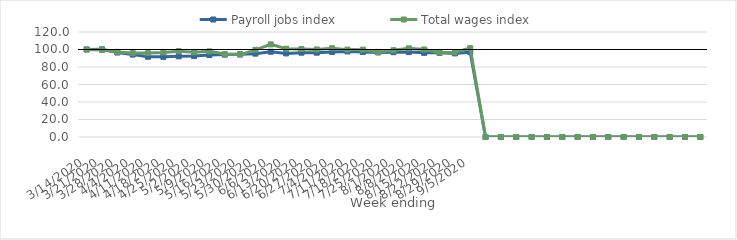
| Category | Payroll jobs index | Total wages index |
|---|---|---|
| 14/03/2020 | 100 | 100 |
| 21/03/2020 | 100.189 | 99.439 |
| 28/03/2020 | 96.506 | 97.26 |
| 04/04/2020 | 94.186 | 95.905 |
| 11/04/2020 | 91.72 | 95.882 |
| 18/04/2020 | 91.616 | 96.706 |
| 25/04/2020 | 92.19 | 98.115 |
| 02/05/2020 | 92.539 | 96.815 |
| 09/05/2020 | 93.631 | 97.867 |
| 16/05/2020 | 94.144 | 94.782 |
| 23/05/2020 | 94.614 | 94.154 |
| 30/05/2020 | 95.275 | 99.627 |
| 06/06/2020 | 97.444 | 105.823 |
| 13/06/2020 | 95.487 | 100.922 |
| 20/06/2020 | 96.361 | 100.434 |
| 27/06/2020 | 96.385 | 100.04 |
| 04/07/2020 | 97.232 | 101.526 |
| 11/07/2020 | 97.802 | 99.859 |
| 18/07/2020 | 97.189 | 99.794 |
| 25/07/2020 | 96.652 | 97.287 |
| 01/08/2020 | 96.902 | 99.144 |
| 08/08/2020 | 97.029 | 101.331 |
| 15/08/2020 | 96.165 | 100.036 |
| 22/08/2020 | 96.171 | 96.66 |
| 29/08/2020 | 95.53 | 96.818 |
| 05/09/2020 | 96.982 | 101.489 |